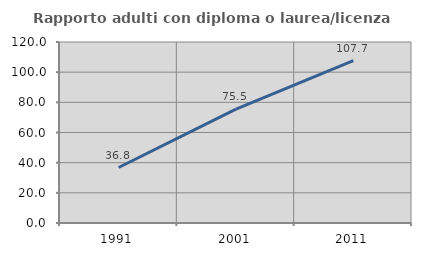
| Category | Rapporto adulti con diploma o laurea/licenza media  |
|---|---|
| 1991.0 | 36.789 |
| 2001.0 | 75.54 |
| 2011.0 | 107.692 |